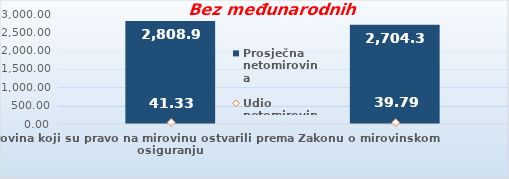
| Category | Prosječna netomirovina  |
|---|---|
| Korisnici mirovina koji su pravo na mirovinu ostvarili prema Zakonu o mirovinskom osiguranju  | 2808.93 |
| Korisnici koji su pravo na mirovinu PRVI PUT ostvarili u 2020. godini prema Zakonu o mirovinskom osiguranju - NOVI KORISNICI | 2704.34 |